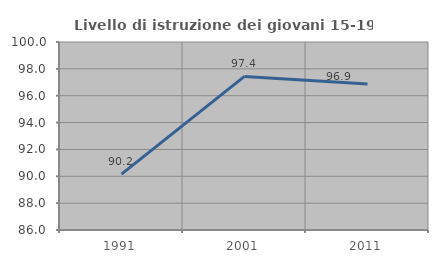
| Category | Livello di istruzione dei giovani 15-19 anni |
|---|---|
| 1991.0 | 90.164 |
| 2001.0 | 97.436 |
| 2011.0 | 96.875 |